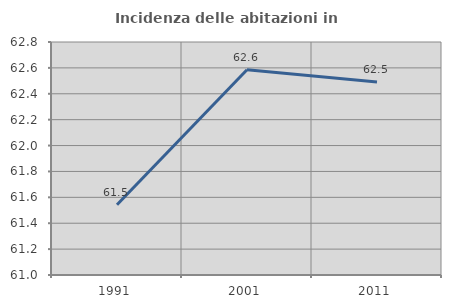
| Category | Incidenza delle abitazioni in proprietà  |
|---|---|
| 1991.0 | 61.542 |
| 2001.0 | 62.586 |
| 2011.0 | 62.49 |